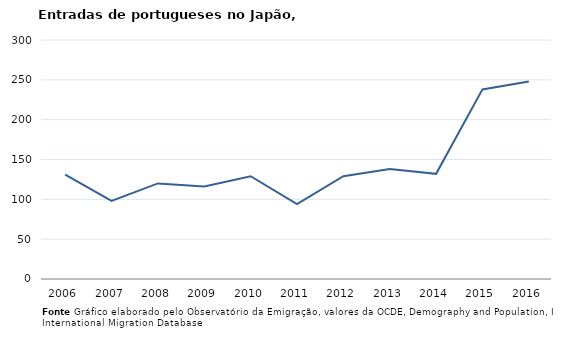
| Category | Entradas |
|---|---|
| 2006.0 | 131 |
| 2007.0 | 98 |
| 2008.0 | 120 |
| 2009.0 | 116 |
| 2010.0 | 129 |
| 2011.0 | 94 |
| 2012.0 | 129 |
| 2013.0 | 138 |
| 2014.0 | 132 |
| 2015.0 | 238 |
| 2016.0 | 248 |